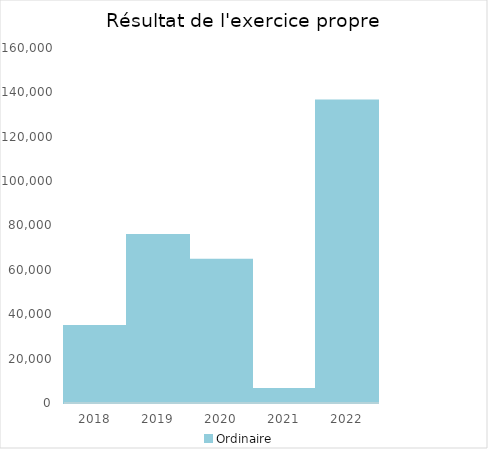
| Category |   | Ordinaire |    |
|---|---|---|---|
| 2018.0 |  | 34687.51 |  |
| 2019.0 |  | 75694.58 |  |
| 2020.0 |  | 64562.15 |  |
| 2021.0 |  | 6288.33 |  |
| 2022.0 |  | 136331.43 |  |